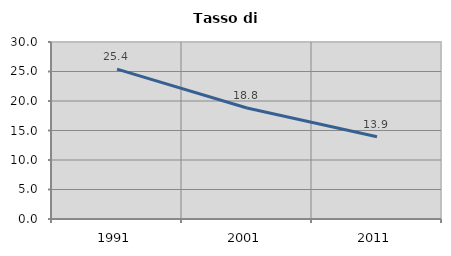
| Category | Tasso di disoccupazione   |
|---|---|
| 1991.0 | 25.392 |
| 2001.0 | 18.823 |
| 2011.0 | 13.93 |